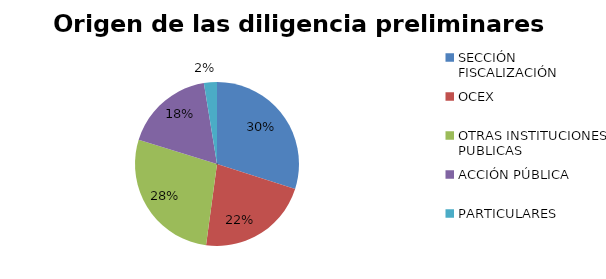
| Category | Series 0 |
|---|---|
| SECCIÓN FISCALIZACIÓN | 105 |
| OCEX | 78 |
| OTRAS INSTITUCIONES PUBLICAS | 97 |
| ACCIÓN PÚBLICA | 62 |
| PARTICULARES | 9 |